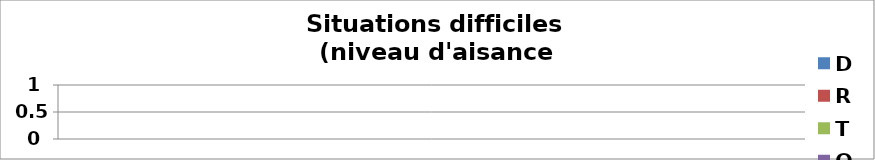
| Category | D | R | T | O |
|---|---|---|---|---|
| 0 | 0 | 0 | 0 | 0 |